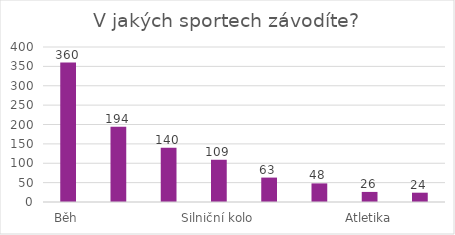
| Category | Series 0 |
|---|---|
| Běh | 360 |
| Horské kolo | 194 |
| Triatlon (MTB + Silnice) | 140 |
| Silniční kolo | 109 |
| Běžky | 63 |
| Jiné | 48 |
| Atletika | 26 |
| Plavání | 24 |